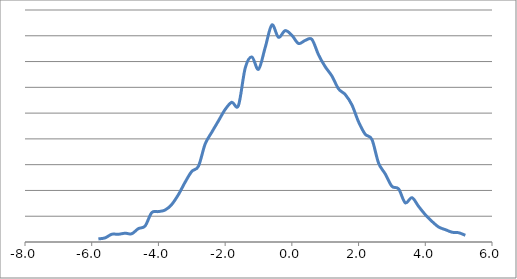
| Category | Series 0 |
|---|---|
| -5.8 | 6 |
| -5.6 | 8 |
| -5.4 | 15 |
| -5.2 | 15 |
| -5.0 | 17 |
| -4.8 | 16 |
| -4.6 | 26 |
| -4.3999999999999995 | 31 |
| -4.199999999999999 | 57 |
| -3.999999999999999 | 59 |
| -3.799999999999999 | 62 |
| -3.5999999999999988 | 73 |
| -3.3999999999999986 | 92 |
| -3.1999999999999984 | 116 |
| -2.9999999999999982 | 137 |
| -2.799999999999998 | 147 |
| -2.599999999999998 | 190 |
| -2.3999999999999977 | 213 |
| -2.1999999999999975 | 235 |
| -1.9999999999999976 | 257 |
| -1.7999999999999976 | 271 |
| -1.5999999999999976 | 265 |
| -1.3999999999999977 | 337 |
| -1.1999999999999977 | 359 |
| -0.9999999999999978 | 335 |
| -0.7999999999999978 | 377 |
| -0.5999999999999979 | 421 |
| -0.39999999999999786 | 397 |
| -0.19999999999999785 | 410 |
| 2.1649348980190553e-15 | 401 |
| 0.20000000000000218 | 385 |
| 0.4000000000000022 | 391 |
| 0.6000000000000022 | 393 |
| 0.8000000000000023 | 363 |
| 1.0000000000000022 | 340 |
| 1.2000000000000022 | 322 |
| 1.4000000000000021 | 297 |
| 1.600000000000002 | 286 |
| 1.800000000000002 | 266 |
| 2.000000000000002 | 233 |
| 2.2000000000000024 | 209 |
| 2.4000000000000026 | 199 |
| 2.6000000000000028 | 153 |
| 2.800000000000003 | 132 |
| 3.000000000000003 | 108 |
| 3.2000000000000033 | 103 |
| 3.4000000000000035 | 76 |
| 3.6000000000000036 | 86 |
| 3.800000000000004 | 69 |
| 4.0000000000000036 | 53 |
| 4.200000000000004 | 40 |
| 4.400000000000004 | 29 |
| 4.600000000000004 | 24 |
| 4.800000000000004 | 19 |
| 5.000000000000004 | 18 |
| 5.2 | 13 |